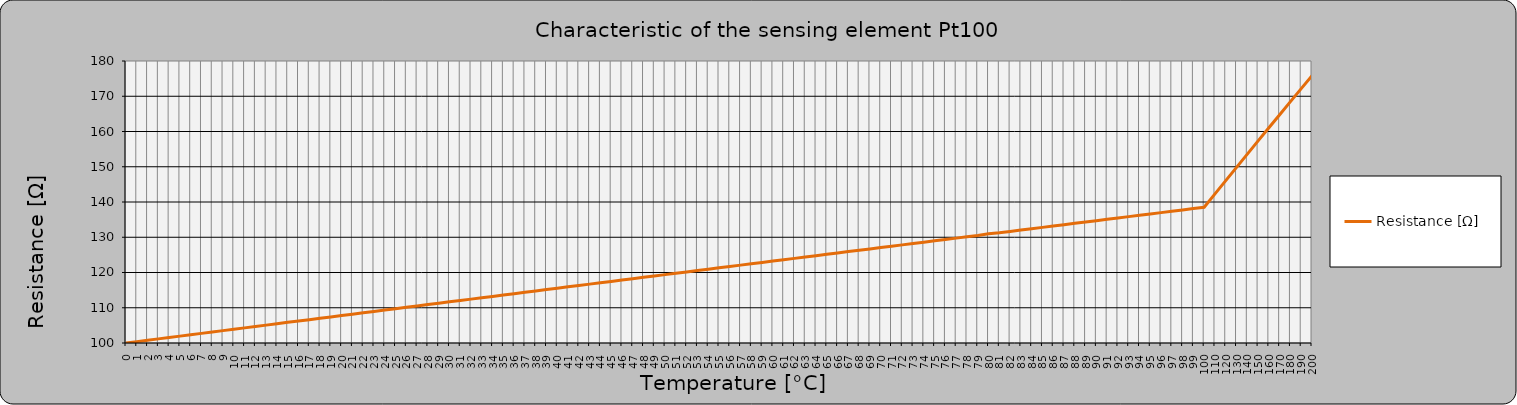
| Category | Resistance [Ω] |
|---|---|
| 0.0 | 100 |
| 1.0 | 100.391 |
| 2.0 | 100.781 |
| 3.0 | 101.172 |
| 4.0 | 101.562 |
| 5.0 | 101.953 |
| 6.0 | 102.343 |
| 7.0 | 102.733 |
| 8.0 | 103.123 |
| 9.0 | 103.513 |
| 10.0 | 103.903 |
| 11.0 | 104.292 |
| 12.0 | 104.682 |
| 13.0 | 105.071 |
| 14.0 | 105.46 |
| 15.0 | 105.859 |
| 16.0 | 106.238 |
| 17.0 | 106.627 |
| 18.0 | 107.016 |
| 19.0 | 107.405 |
| 20.0 | 107.794 |
| 21.0 | 108.182 |
| 22.0 | 108.57 |
| 23.0 | 108.959 |
| 24.0 | 109.347 |
| 25.0 | 109.735 |
| 26.0 | 110.123 |
| 27.0 | 110.51 |
| 28.0 | 110.898 |
| 29.0 | 111.286 |
| 30.0 | 111.673 |
| 31.0 | 112.06 |
| 32.0 | 112.447 |
| 33.0 | 112.835 |
| 34.0 | 113.221 |
| 35.0 | 113.608 |
| 36.0 | 113.995 |
| 37.0 | 114.382 |
| 38.0 | 114.768 |
| 39.0 | 115.155 |
| 40.0 | 115.541 |
| 41.0 | 115.927 |
| 42.0 | 116.313 |
| 43.0 | 116.699 |
| 44.0 | 117.085 |
| 45.0 | 117.47 |
| 46.0 | 117.856 |
| 47.0 | 118.241 |
| 48.0 | 118.627 |
| 49.0 | 119.012 |
| 50.0 | 119.397 |
| 51.0 | 119.782 |
| 52.0 | 120.167 |
| 53.0 | 120.552 |
| 54.0 | 120.936 |
| 55.0 | 121.321 |
| 56.0 | 121.705 |
| 57.0 | 122.09 |
| 58.0 | 122.474 |
| 59.0 | 122.858 |
| 60.0 | 123.242 |
| 61.0 | 123.626 |
| 62.0 | 124.009 |
| 63.0 | 124.393 |
| 64.0 | 124.777 |
| 65.0 | 125.16 |
| 66.0 | 125.543 |
| 67.0 | 125.926 |
| 68.0 | 126.309 |
| 69.0 | 126.692 |
| 70.0 | 127.075 |
| 71.0 | 127.458 |
| 72.0 | 127.84 |
| 73.0 | 128.223 |
| 74.0 | 128.605 |
| 75.0 | 128.987 |
| 76.0 | 129.37 |
| 77.0 | 129.752 |
| 78.0 | 130.133 |
| 79.0 | 130.515 |
| 80.0 | 130.97 |
| 81.0 | 131.278 |
| 82.0 | 131.66 |
| 83.0 | 132.041 |
| 84.0 | 132.422 |
| 85.0 | 132.803 |
| 86.0 | 133.184 |
| 87.0 | 133.565 |
| 88.0 | 133.946 |
| 89.0 | 134.326 |
| 90.0 | 134.707 |
| 91.0 | 135.087 |
| 92.0 | 135.468 |
| 93.0 | 135.848 |
| 94.0 | 136.228 |
| 95.0 | 136.608 |
| 96.0 | 136.987 |
| 97.0 | 137.367 |
| 98.0 | 137.747 |
| 99.0 | 138.126 |
| 100.0 | 138.506 |
| 110.0 | 142.29 |
| 120.0 | 146.07 |
| 130.0 | 149.832 |
| 140.0 | 153.58 |
| 150.0 | 157.33 |
| 160.0 | 161.05 |
| 170.0 | 164.77 |
| 180.0 | 168.48 |
| 190.0 | 172.17 |
| 200.0 | 175.86 |